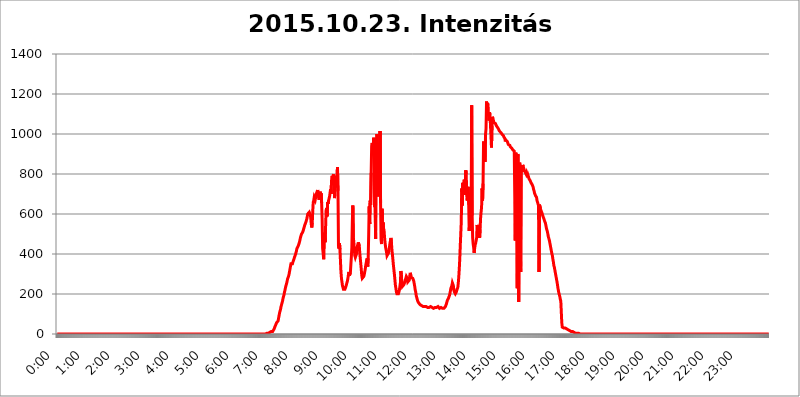
| Category | 2015.10.23. Intenzitás [W/m^2] |
|---|---|
| 0.0 | 0 |
| 0.0006944444444444445 | 0 |
| 0.001388888888888889 | 0 |
| 0.0020833333333333333 | 0 |
| 0.002777777777777778 | 0 |
| 0.003472222222222222 | 0 |
| 0.004166666666666667 | 0 |
| 0.004861111111111111 | 0 |
| 0.005555555555555556 | 0 |
| 0.0062499999999999995 | 0 |
| 0.006944444444444444 | 0 |
| 0.007638888888888889 | 0 |
| 0.008333333333333333 | 0 |
| 0.009027777777777779 | 0 |
| 0.009722222222222222 | 0 |
| 0.010416666666666666 | 0 |
| 0.011111111111111112 | 0 |
| 0.011805555555555555 | 0 |
| 0.012499999999999999 | 0 |
| 0.013194444444444444 | 0 |
| 0.013888888888888888 | 0 |
| 0.014583333333333332 | 0 |
| 0.015277777777777777 | 0 |
| 0.015972222222222224 | 0 |
| 0.016666666666666666 | 0 |
| 0.017361111111111112 | 0 |
| 0.018055555555555557 | 0 |
| 0.01875 | 0 |
| 0.019444444444444445 | 0 |
| 0.02013888888888889 | 0 |
| 0.020833333333333332 | 0 |
| 0.02152777777777778 | 0 |
| 0.022222222222222223 | 0 |
| 0.02291666666666667 | 0 |
| 0.02361111111111111 | 0 |
| 0.024305555555555556 | 0 |
| 0.024999999999999998 | 0 |
| 0.025694444444444447 | 0 |
| 0.02638888888888889 | 0 |
| 0.027083333333333334 | 0 |
| 0.027777777777777776 | 0 |
| 0.02847222222222222 | 0 |
| 0.029166666666666664 | 0 |
| 0.029861111111111113 | 0 |
| 0.030555555555555555 | 0 |
| 0.03125 | 0 |
| 0.03194444444444445 | 0 |
| 0.03263888888888889 | 0 |
| 0.03333333333333333 | 0 |
| 0.034027777777777775 | 0 |
| 0.034722222222222224 | 0 |
| 0.035416666666666666 | 0 |
| 0.036111111111111115 | 0 |
| 0.03680555555555556 | 0 |
| 0.0375 | 0 |
| 0.03819444444444444 | 0 |
| 0.03888888888888889 | 0 |
| 0.03958333333333333 | 0 |
| 0.04027777777777778 | 0 |
| 0.04097222222222222 | 0 |
| 0.041666666666666664 | 0 |
| 0.042361111111111106 | 0 |
| 0.04305555555555556 | 0 |
| 0.043750000000000004 | 0 |
| 0.044444444444444446 | 0 |
| 0.04513888888888889 | 0 |
| 0.04583333333333334 | 0 |
| 0.04652777777777778 | 0 |
| 0.04722222222222222 | 0 |
| 0.04791666666666666 | 0 |
| 0.04861111111111111 | 0 |
| 0.049305555555555554 | 0 |
| 0.049999999999999996 | 0 |
| 0.05069444444444445 | 0 |
| 0.051388888888888894 | 0 |
| 0.052083333333333336 | 0 |
| 0.05277777777777778 | 0 |
| 0.05347222222222222 | 0 |
| 0.05416666666666667 | 0 |
| 0.05486111111111111 | 0 |
| 0.05555555555555555 | 0 |
| 0.05625 | 0 |
| 0.05694444444444444 | 0 |
| 0.057638888888888885 | 0 |
| 0.05833333333333333 | 0 |
| 0.05902777777777778 | 0 |
| 0.059722222222222225 | 0 |
| 0.06041666666666667 | 0 |
| 0.061111111111111116 | 0 |
| 0.06180555555555556 | 0 |
| 0.0625 | 0 |
| 0.06319444444444444 | 0 |
| 0.06388888888888888 | 0 |
| 0.06458333333333334 | 0 |
| 0.06527777777777778 | 0 |
| 0.06597222222222222 | 0 |
| 0.06666666666666667 | 0 |
| 0.06736111111111111 | 0 |
| 0.06805555555555555 | 0 |
| 0.06874999999999999 | 0 |
| 0.06944444444444443 | 0 |
| 0.07013888888888889 | 0 |
| 0.07083333333333333 | 0 |
| 0.07152777777777779 | 0 |
| 0.07222222222222223 | 0 |
| 0.07291666666666667 | 0 |
| 0.07361111111111111 | 0 |
| 0.07430555555555556 | 0 |
| 0.075 | 0 |
| 0.07569444444444444 | 0 |
| 0.0763888888888889 | 0 |
| 0.07708333333333334 | 0 |
| 0.07777777777777778 | 0 |
| 0.07847222222222222 | 0 |
| 0.07916666666666666 | 0 |
| 0.0798611111111111 | 0 |
| 0.08055555555555556 | 0 |
| 0.08125 | 0 |
| 0.08194444444444444 | 0 |
| 0.08263888888888889 | 0 |
| 0.08333333333333333 | 0 |
| 0.08402777777777777 | 0 |
| 0.08472222222222221 | 0 |
| 0.08541666666666665 | 0 |
| 0.08611111111111112 | 0 |
| 0.08680555555555557 | 0 |
| 0.08750000000000001 | 0 |
| 0.08819444444444445 | 0 |
| 0.08888888888888889 | 0 |
| 0.08958333333333333 | 0 |
| 0.09027777777777778 | 0 |
| 0.09097222222222222 | 0 |
| 0.09166666666666667 | 0 |
| 0.09236111111111112 | 0 |
| 0.09305555555555556 | 0 |
| 0.09375 | 0 |
| 0.09444444444444444 | 0 |
| 0.09513888888888888 | 0 |
| 0.09583333333333333 | 0 |
| 0.09652777777777777 | 0 |
| 0.09722222222222222 | 0 |
| 0.09791666666666667 | 0 |
| 0.09861111111111111 | 0 |
| 0.09930555555555555 | 0 |
| 0.09999999999999999 | 0 |
| 0.10069444444444443 | 0 |
| 0.1013888888888889 | 0 |
| 0.10208333333333335 | 0 |
| 0.10277777777777779 | 0 |
| 0.10347222222222223 | 0 |
| 0.10416666666666667 | 0 |
| 0.10486111111111111 | 0 |
| 0.10555555555555556 | 0 |
| 0.10625 | 0 |
| 0.10694444444444444 | 0 |
| 0.1076388888888889 | 0 |
| 0.10833333333333334 | 0 |
| 0.10902777777777778 | 0 |
| 0.10972222222222222 | 0 |
| 0.1111111111111111 | 0 |
| 0.11180555555555556 | 0 |
| 0.11180555555555556 | 0 |
| 0.1125 | 0 |
| 0.11319444444444444 | 0 |
| 0.11388888888888889 | 0 |
| 0.11458333333333333 | 0 |
| 0.11527777777777777 | 0 |
| 0.11597222222222221 | 0 |
| 0.11666666666666665 | 0 |
| 0.1173611111111111 | 0 |
| 0.11805555555555557 | 0 |
| 0.11944444444444445 | 0 |
| 0.12013888888888889 | 0 |
| 0.12083333333333333 | 0 |
| 0.12152777777777778 | 0 |
| 0.12222222222222223 | 0 |
| 0.12291666666666667 | 0 |
| 0.12291666666666667 | 0 |
| 0.12361111111111112 | 0 |
| 0.12430555555555556 | 0 |
| 0.125 | 0 |
| 0.12569444444444444 | 0 |
| 0.12638888888888888 | 0 |
| 0.12708333333333333 | 0 |
| 0.16875 | 0 |
| 0.12847222222222224 | 0 |
| 0.12916666666666668 | 0 |
| 0.12986111111111112 | 0 |
| 0.13055555555555556 | 0 |
| 0.13125 | 0 |
| 0.13194444444444445 | 0 |
| 0.1326388888888889 | 0 |
| 0.13333333333333333 | 0 |
| 0.13402777777777777 | 0 |
| 0.13402777777777777 | 0 |
| 0.13472222222222222 | 0 |
| 0.13541666666666666 | 0 |
| 0.1361111111111111 | 0 |
| 0.13749999999999998 | 0 |
| 0.13819444444444443 | 0 |
| 0.1388888888888889 | 0 |
| 0.13958333333333334 | 0 |
| 0.14027777777777778 | 0 |
| 0.14097222222222222 | 0 |
| 0.14166666666666666 | 0 |
| 0.1423611111111111 | 0 |
| 0.14305555555555557 | 0 |
| 0.14375000000000002 | 0 |
| 0.14444444444444446 | 0 |
| 0.1451388888888889 | 0 |
| 0.1451388888888889 | 0 |
| 0.14652777777777778 | 0 |
| 0.14722222222222223 | 0 |
| 0.14791666666666667 | 0 |
| 0.1486111111111111 | 0 |
| 0.14930555555555555 | 0 |
| 0.15 | 0 |
| 0.15069444444444444 | 0 |
| 0.15138888888888888 | 0 |
| 0.15208333333333332 | 0 |
| 0.15277777777777776 | 0 |
| 0.15347222222222223 | 0 |
| 0.15416666666666667 | 0 |
| 0.15486111111111112 | 0 |
| 0.15555555555555556 | 0 |
| 0.15625 | 0 |
| 0.15694444444444444 | 0 |
| 0.15763888888888888 | 0 |
| 0.15833333333333333 | 0 |
| 0.15902777777777777 | 0 |
| 0.15972222222222224 | 0 |
| 0.16041666666666668 | 0 |
| 0.16111111111111112 | 0 |
| 0.16180555555555556 | 0 |
| 0.1625 | 0 |
| 0.16319444444444445 | 0 |
| 0.1638888888888889 | 0 |
| 0.16458333333333333 | 0 |
| 0.16527777777777777 | 0 |
| 0.16597222222222222 | 0 |
| 0.16666666666666666 | 0 |
| 0.1673611111111111 | 0 |
| 0.16805555555555554 | 0 |
| 0.16874999999999998 | 0 |
| 0.16944444444444443 | 0 |
| 0.17013888888888887 | 0 |
| 0.1708333333333333 | 0 |
| 0.17152777777777775 | 0 |
| 0.17222222222222225 | 0 |
| 0.1729166666666667 | 0 |
| 0.17361111111111113 | 0 |
| 0.17430555555555557 | 0 |
| 0.17500000000000002 | 0 |
| 0.17569444444444446 | 0 |
| 0.1763888888888889 | 0 |
| 0.17708333333333334 | 0 |
| 0.17777777777777778 | 0 |
| 0.17847222222222223 | 0 |
| 0.17916666666666667 | 0 |
| 0.1798611111111111 | 0 |
| 0.18055555555555555 | 0 |
| 0.18125 | 0 |
| 0.18194444444444444 | 0 |
| 0.1826388888888889 | 0 |
| 0.18333333333333335 | 0 |
| 0.1840277777777778 | 0 |
| 0.18472222222222223 | 0 |
| 0.18541666666666667 | 0 |
| 0.18611111111111112 | 0 |
| 0.18680555555555556 | 0 |
| 0.1875 | 0 |
| 0.18819444444444444 | 0 |
| 0.18888888888888888 | 0 |
| 0.18958333333333333 | 0 |
| 0.19027777777777777 | 0 |
| 0.1909722222222222 | 0 |
| 0.19166666666666665 | 0 |
| 0.19236111111111112 | 0 |
| 0.19305555555555554 | 0 |
| 0.19375 | 0 |
| 0.19444444444444445 | 0 |
| 0.1951388888888889 | 0 |
| 0.19583333333333333 | 0 |
| 0.19652777777777777 | 0 |
| 0.19722222222222222 | 0 |
| 0.19791666666666666 | 0 |
| 0.1986111111111111 | 0 |
| 0.19930555555555554 | 0 |
| 0.19999999999999998 | 0 |
| 0.20069444444444443 | 0 |
| 0.20138888888888887 | 0 |
| 0.2020833333333333 | 0 |
| 0.2027777777777778 | 0 |
| 0.2034722222222222 | 0 |
| 0.2041666666666667 | 0 |
| 0.20486111111111113 | 0 |
| 0.20555555555555557 | 0 |
| 0.20625000000000002 | 0 |
| 0.20694444444444446 | 0 |
| 0.2076388888888889 | 0 |
| 0.20833333333333334 | 0 |
| 0.20902777777777778 | 0 |
| 0.20972222222222223 | 0 |
| 0.21041666666666667 | 0 |
| 0.2111111111111111 | 0 |
| 0.21180555555555555 | 0 |
| 0.2125 | 0 |
| 0.21319444444444444 | 0 |
| 0.2138888888888889 | 0 |
| 0.21458333333333335 | 0 |
| 0.2152777777777778 | 0 |
| 0.21597222222222223 | 0 |
| 0.21666666666666667 | 0 |
| 0.21736111111111112 | 0 |
| 0.21805555555555556 | 0 |
| 0.21875 | 0 |
| 0.21944444444444444 | 0 |
| 0.22013888888888888 | 0 |
| 0.22083333333333333 | 0 |
| 0.22152777777777777 | 0 |
| 0.2222222222222222 | 0 |
| 0.22291666666666665 | 0 |
| 0.2236111111111111 | 0 |
| 0.22430555555555556 | 0 |
| 0.225 | 0 |
| 0.22569444444444445 | 0 |
| 0.2263888888888889 | 0 |
| 0.22708333333333333 | 0 |
| 0.22777777777777777 | 0 |
| 0.22847222222222222 | 0 |
| 0.22916666666666666 | 0 |
| 0.2298611111111111 | 0 |
| 0.23055555555555554 | 0 |
| 0.23124999999999998 | 0 |
| 0.23194444444444443 | 0 |
| 0.23263888888888887 | 0 |
| 0.2333333333333333 | 0 |
| 0.2340277777777778 | 0 |
| 0.2347222222222222 | 0 |
| 0.2354166666666667 | 0 |
| 0.23611111111111113 | 0 |
| 0.23680555555555557 | 0 |
| 0.23750000000000002 | 0 |
| 0.23819444444444446 | 0 |
| 0.2388888888888889 | 0 |
| 0.23958333333333334 | 0 |
| 0.24027777777777778 | 0 |
| 0.24097222222222223 | 0 |
| 0.24166666666666667 | 0 |
| 0.2423611111111111 | 0 |
| 0.24305555555555555 | 0 |
| 0.24375 | 0 |
| 0.24444444444444446 | 0 |
| 0.24513888888888888 | 0 |
| 0.24583333333333335 | 0 |
| 0.2465277777777778 | 0 |
| 0.24722222222222223 | 0 |
| 0.24791666666666667 | 0 |
| 0.24861111111111112 | 0 |
| 0.24930555555555556 | 0 |
| 0.25 | 0 |
| 0.25069444444444444 | 0 |
| 0.2513888888888889 | 0 |
| 0.2520833333333333 | 0 |
| 0.25277777777777777 | 0 |
| 0.2534722222222222 | 0 |
| 0.25416666666666665 | 0 |
| 0.2548611111111111 | 0 |
| 0.2555555555555556 | 0 |
| 0.25625000000000003 | 0 |
| 0.2569444444444445 | 0 |
| 0.2576388888888889 | 0 |
| 0.25833333333333336 | 0 |
| 0.2590277777777778 | 0 |
| 0.25972222222222224 | 0 |
| 0.2604166666666667 | 0 |
| 0.2611111111111111 | 0 |
| 0.26180555555555557 | 0 |
| 0.2625 | 0 |
| 0.26319444444444445 | 0 |
| 0.2638888888888889 | 0 |
| 0.26458333333333334 | 0 |
| 0.2652777777777778 | 0 |
| 0.2659722222222222 | 0 |
| 0.26666666666666666 | 0 |
| 0.2673611111111111 | 0 |
| 0.26805555555555555 | 0 |
| 0.26875 | 0 |
| 0.26944444444444443 | 0 |
| 0.2701388888888889 | 0 |
| 0.2708333333333333 | 0 |
| 0.27152777777777776 | 0 |
| 0.2722222222222222 | 0 |
| 0.27291666666666664 | 0 |
| 0.2736111111111111 | 0 |
| 0.2743055555555555 | 0 |
| 0.27499999999999997 | 0 |
| 0.27569444444444446 | 0 |
| 0.27638888888888885 | 0 |
| 0.27708333333333335 | 0 |
| 0.2777777777777778 | 0 |
| 0.27847222222222223 | 0 |
| 0.2791666666666667 | 0 |
| 0.2798611111111111 | 0 |
| 0.28055555555555556 | 0 |
| 0.28125 | 0 |
| 0.28194444444444444 | 0 |
| 0.2826388888888889 | 0 |
| 0.2833333333333333 | 0 |
| 0.28402777777777777 | 0 |
| 0.2847222222222222 | 0 |
| 0.28541666666666665 | 0 |
| 0.28611111111111115 | 0 |
| 0.28680555555555554 | 0 |
| 0.28750000000000003 | 0 |
| 0.2881944444444445 | 0 |
| 0.2888888888888889 | 0 |
| 0.28958333333333336 | 0 |
| 0.2902777777777778 | 0 |
| 0.29097222222222224 | 0 |
| 0.2916666666666667 | 0 |
| 0.2923611111111111 | 0 |
| 0.29305555555555557 | 3.525 |
| 0.29375 | 3.525 |
| 0.29444444444444445 | 3.525 |
| 0.2951388888888889 | 3.525 |
| 0.29583333333333334 | 3.525 |
| 0.2965277777777778 | 3.525 |
| 0.2972222222222222 | 3.525 |
| 0.29791666666666666 | 7.887 |
| 0.2986111111111111 | 7.887 |
| 0.29930555555555555 | 7.887 |
| 0.3 | 12.257 |
| 0.30069444444444443 | 12.257 |
| 0.3013888888888889 | 12.257 |
| 0.3020833333333333 | 12.257 |
| 0.30277777777777776 | 16.636 |
| 0.3034722222222222 | 16.636 |
| 0.30416666666666664 | 25.419 |
| 0.3048611111111111 | 29.823 |
| 0.3055555555555555 | 38.653 |
| 0.30624999999999997 | 43.079 |
| 0.3069444444444444 | 43.079 |
| 0.3076388888888889 | 56.398 |
| 0.30833333333333335 | 60.85 |
| 0.3090277777777778 | 60.85 |
| 0.30972222222222223 | 65.31 |
| 0.3104166666666667 | 78.722 |
| 0.3111111111111111 | 92.184 |
| 0.31180555555555556 | 105.69 |
| 0.3125 | 114.716 |
| 0.31319444444444444 | 123.758 |
| 0.3138888888888889 | 137.347 |
| 0.3145833333333333 | 146.423 |
| 0.31527777777777777 | 155.509 |
| 0.3159722222222222 | 164.605 |
| 0.31666666666666665 | 178.264 |
| 0.31736111111111115 | 187.378 |
| 0.31805555555555554 | 196.497 |
| 0.31875000000000003 | 210.182 |
| 0.3194444444444445 | 219.309 |
| 0.3201388888888889 | 233 |
| 0.32083333333333336 | 242.127 |
| 0.3215277777777778 | 251.251 |
| 0.32222222222222224 | 260.373 |
| 0.3229166666666667 | 274.047 |
| 0.3236111111111111 | 278.603 |
| 0.32430555555555557 | 287.709 |
| 0.325 | 296.808 |
| 0.32569444444444445 | 310.44 |
| 0.3263888888888889 | 324.052 |
| 0.32708333333333334 | 337.639 |
| 0.3277777777777778 | 351.198 |
| 0.3284722222222222 | 351.198 |
| 0.32916666666666666 | 351.198 |
| 0.3298611111111111 | 351.198 |
| 0.33055555555555555 | 360.221 |
| 0.33125 | 364.728 |
| 0.33194444444444443 | 373.729 |
| 0.3326388888888889 | 382.715 |
| 0.3333333333333333 | 382.715 |
| 0.3340277777777778 | 396.164 |
| 0.3347222222222222 | 405.108 |
| 0.3354166666666667 | 414.035 |
| 0.3361111111111111 | 427.39 |
| 0.3368055555555556 | 431.833 |
| 0.33749999999999997 | 436.27 |
| 0.33819444444444446 | 440.702 |
| 0.33888888888888885 | 449.551 |
| 0.33958333333333335 | 458.38 |
| 0.34027777777777773 | 467.187 |
| 0.34097222222222223 | 480.356 |
| 0.3416666666666666 | 480.356 |
| 0.3423611111111111 | 497.836 |
| 0.3430555555555555 | 497.836 |
| 0.34375 | 502.192 |
| 0.3444444444444445 | 510.885 |
| 0.3451388888888889 | 515.223 |
| 0.3458333333333334 | 515.223 |
| 0.34652777777777777 | 536.82 |
| 0.34722222222222227 | 545.416 |
| 0.34791666666666665 | 549.704 |
| 0.34861111111111115 | 558.261 |
| 0.34930555555555554 | 562.53 |
| 0.35000000000000003 | 575.299 |
| 0.3506944444444444 | 588.009 |
| 0.3513888888888889 | 600.661 |
| 0.3520833333333333 | 604.864 |
| 0.3527777777777778 | 600.661 |
| 0.3534722222222222 | 609.062 |
| 0.3541666666666667 | 613.252 |
| 0.3548611111111111 | 596.45 |
| 0.35555555555555557 | 579.542 |
| 0.35625 | 549.704 |
| 0.35694444444444445 | 532.513 |
| 0.3576388888888889 | 553.986 |
| 0.35833333333333334 | 613.252 |
| 0.3590277777777778 | 658.909 |
| 0.3597222222222222 | 667.123 |
| 0.36041666666666666 | 683.473 |
| 0.3611111111111111 | 679.395 |
| 0.36180555555555555 | 671.22 |
| 0.3625 | 675.311 |
| 0.36319444444444443 | 699.717 |
| 0.3638888888888889 | 703.762 |
| 0.3645833333333333 | 699.717 |
| 0.3652777777777778 | 719.877 |
| 0.3659722222222222 | 715.858 |
| 0.3666666666666667 | 719.877 |
| 0.3673611111111111 | 671.22 |
| 0.3680555555555556 | 679.395 |
| 0.36874999999999997 | 711.832 |
| 0.36944444444444446 | 683.473 |
| 0.37013888888888885 | 703.762 |
| 0.37083333333333335 | 654.791 |
| 0.37152777777777773 | 571.049 |
| 0.37222222222222223 | 427.39 |
| 0.3729166666666666 | 405.108 |
| 0.3736111111111111 | 373.729 |
| 0.3743055555555555 | 480.356 |
| 0.375 | 506.542 |
| 0.3756944444444445 | 458.38 |
| 0.3763888888888889 | 536.82 |
| 0.3770833333333334 | 617.436 |
| 0.37777777777777777 | 629.948 |
| 0.37847222222222227 | 588.009 |
| 0.37916666666666665 | 658.909 |
| 0.37986111111111115 | 650.667 |
| 0.38055555555555554 | 667.123 |
| 0.38125000000000003 | 667.123 |
| 0.3819444444444444 | 687.544 |
| 0.3826388888888889 | 691.608 |
| 0.3833333333333333 | 723.889 |
| 0.3840277777777778 | 699.717 |
| 0.3847222222222222 | 767.62 |
| 0.3854166666666667 | 791.169 |
| 0.3861111111111111 | 783.342 |
| 0.38680555555555557 | 779.42 |
| 0.3875 | 798.974 |
| 0.38819444444444445 | 763.674 |
| 0.3888888888888889 | 679.395 |
| 0.38958333333333334 | 723.889 |
| 0.3902777777777778 | 735.89 |
| 0.3909722222222222 | 755.766 |
| 0.39166666666666666 | 791.169 |
| 0.3923611111111111 | 783.342 |
| 0.39305555555555555 | 833.834 |
| 0.39375 | 715.858 |
| 0.39444444444444443 | 440.702 |
| 0.3951388888888889 | 427.39 |
| 0.3958333333333333 | 453.968 |
| 0.3965277777777778 | 422.943 |
| 0.3972222222222222 | 364.728 |
| 0.3979166666666667 | 310.44 |
| 0.3986111111111111 | 278.603 |
| 0.3993055555555556 | 260.373 |
| 0.39999999999999997 | 242.127 |
| 0.40069444444444446 | 233 |
| 0.40138888888888885 | 223.873 |
| 0.40208333333333335 | 219.309 |
| 0.40277777777777773 | 219.309 |
| 0.40347222222222223 | 223.873 |
| 0.4041666666666666 | 228.436 |
| 0.4048611111111111 | 237.564 |
| 0.4055555555555555 | 246.689 |
| 0.40625 | 255.813 |
| 0.4069444444444445 | 264.932 |
| 0.4076388888888889 | 278.603 |
| 0.4083333333333334 | 283.156 |
| 0.40902777777777777 | 310.44 |
| 0.40972222222222227 | 292.259 |
| 0.41041666666666665 | 292.259 |
| 0.41111111111111115 | 305.898 |
| 0.41180555555555554 | 310.44 |
| 0.41250000000000003 | 387.202 |
| 0.4131944444444444 | 431.833 |
| 0.4138888888888889 | 562.53 |
| 0.4145833333333333 | 642.4 |
| 0.4152777777777778 | 484.735 |
| 0.4159722222222222 | 458.38 |
| 0.4166666666666667 | 422.943 |
| 0.4173611111111111 | 391.685 |
| 0.41805555555555557 | 382.715 |
| 0.41875 | 387.202 |
| 0.41944444444444445 | 387.202 |
| 0.4201388888888889 | 405.108 |
| 0.42083333333333334 | 436.27 |
| 0.4215277777777778 | 440.702 |
| 0.4222222222222222 | 458.38 |
| 0.42291666666666666 | 462.786 |
| 0.4236111111111111 | 440.702 |
| 0.42430555555555555 | 405.108 |
| 0.425 | 400.638 |
| 0.42569444444444443 | 400.638 |
| 0.4263888888888889 | 324.052 |
| 0.4270833333333333 | 292.259 |
| 0.4277777777777778 | 278.603 |
| 0.4284722222222222 | 278.603 |
| 0.4291666666666667 | 278.603 |
| 0.4298611111111111 | 287.709 |
| 0.4305555555555556 | 296.808 |
| 0.43124999999999997 | 310.44 |
| 0.43194444444444446 | 324.052 |
| 0.43263888888888885 | 342.162 |
| 0.43333333333333335 | 355.712 |
| 0.43402777777777773 | 369.23 |
| 0.43472222222222223 | 378.224 |
| 0.4354166666666666 | 337.639 |
| 0.4361111111111111 | 378.224 |
| 0.4368055555555555 | 497.836 |
| 0.4375 | 638.256 |
| 0.4381944444444445 | 549.704 |
| 0.4388888888888889 | 667.123 |
| 0.4395833333333334 | 646.537 |
| 0.44027777777777777 | 806.757 |
| 0.44097222222222227 | 940.082 |
| 0.44166666666666665 | 955.071 |
| 0.44236111111111115 | 943.832 |
| 0.44305555555555554 | 932.576 |
| 0.44375000000000003 | 981.244 |
| 0.4444444444444444 | 891.099 |
| 0.4451388888888889 | 634.105 |
| 0.4458333333333333 | 667.123 |
| 0.4465277777777778 | 475.972 |
| 0.4472222222222222 | 977.508 |
| 0.4479166666666667 | 962.555 |
| 0.4486111111111111 | 999.916 |
| 0.44930555555555557 | 860.676 |
| 0.45 | 687.544 |
| 0.45069444444444445 | 928.819 |
| 0.4513888888888889 | 955.071 |
| 0.45208333333333334 | 711.832 |
| 0.4527777777777778 | 1014.852 |
| 0.4534722222222222 | 654.791 |
| 0.45416666666666666 | 471.582 |
| 0.4548611111111111 | 449.551 |
| 0.45555555555555555 | 625.784 |
| 0.45625 | 523.88 |
| 0.45694444444444443 | 558.261 |
| 0.4576388888888889 | 528.2 |
| 0.4583333333333333 | 519.555 |
| 0.4590277777777778 | 484.735 |
| 0.4597222222222222 | 458.38 |
| 0.4604166666666667 | 436.27 |
| 0.4611111111111111 | 422.943 |
| 0.4618055555555556 | 409.574 |
| 0.46249999999999997 | 391.685 |
| 0.46319444444444446 | 387.202 |
| 0.46388888888888885 | 396.164 |
| 0.46458333333333335 | 405.108 |
| 0.46527777777777773 | 414.035 |
| 0.46597222222222223 | 436.27 |
| 0.4666666666666666 | 453.968 |
| 0.4673611111111111 | 467.187 |
| 0.4680555555555555 | 480.356 |
| 0.46875 | 453.968 |
| 0.4694444444444445 | 418.492 |
| 0.4701388888888889 | 396.164 |
| 0.4708333333333334 | 369.23 |
| 0.47152777777777777 | 342.162 |
| 0.47222222222222227 | 319.517 |
| 0.47291666666666665 | 296.808 |
| 0.47361111111111115 | 269.49 |
| 0.47430555555555554 | 242.127 |
| 0.47500000000000003 | 228.436 |
| 0.4756944444444444 | 210.182 |
| 0.4763888888888889 | 201.058 |
| 0.4770833333333333 | 201.058 |
| 0.4777777777777778 | 201.058 |
| 0.4784722222222222 | 201.058 |
| 0.4791666666666667 | 210.182 |
| 0.4798611111111111 | 219.309 |
| 0.48055555555555557 | 237.564 |
| 0.48125 | 255.813 |
| 0.48194444444444445 | 314.98 |
| 0.4826388888888889 | 296.808 |
| 0.48333333333333334 | 255.813 |
| 0.4840277777777778 | 237.564 |
| 0.4847222222222222 | 237.564 |
| 0.48541666666666666 | 242.127 |
| 0.4861111111111111 | 246.689 |
| 0.48680555555555555 | 251.251 |
| 0.4875 | 260.373 |
| 0.48819444444444443 | 269.49 |
| 0.4888888888888889 | 278.603 |
| 0.4895833333333333 | 287.709 |
| 0.4902777777777778 | 292.259 |
| 0.4909722222222222 | 278.603 |
| 0.4916666666666667 | 260.373 |
| 0.4923611111111111 | 255.813 |
| 0.4930555555555556 | 260.373 |
| 0.49374999999999997 | 269.49 |
| 0.49444444444444446 | 292.259 |
| 0.49513888888888885 | 305.898 |
| 0.49583333333333335 | 296.808 |
| 0.49652777777777773 | 283.156 |
| 0.49722222222222223 | 278.603 |
| 0.4979166666666666 | 278.603 |
| 0.4986111111111111 | 278.603 |
| 0.4993055555555555 | 274.047 |
| 0.5 | 264.932 |
| 0.5006944444444444 | 251.251 |
| 0.5013888888888889 | 237.564 |
| 0.5020833333333333 | 219.309 |
| 0.5027777777777778 | 210.182 |
| 0.5034722222222222 | 191.937 |
| 0.5041666666666667 | 182.82 |
| 0.5048611111111111 | 173.709 |
| 0.5055555555555555 | 164.605 |
| 0.50625 | 160.056 |
| 0.5069444444444444 | 155.509 |
| 0.5076388888888889 | 155.509 |
| 0.5083333333333333 | 150.964 |
| 0.5090277777777777 | 146.423 |
| 0.5097222222222222 | 146.423 |
| 0.5104166666666666 | 146.423 |
| 0.5111111111111112 | 141.884 |
| 0.5118055555555555 | 137.347 |
| 0.5125000000000001 | 137.347 |
| 0.5131944444444444 | 137.347 |
| 0.513888888888889 | 137.347 |
| 0.5145833333333333 | 137.347 |
| 0.5152777777777778 | 137.347 |
| 0.5159722222222222 | 137.347 |
| 0.5166666666666667 | 132.814 |
| 0.517361111111111 | 137.347 |
| 0.5180555555555556 | 137.347 |
| 0.5187499999999999 | 132.814 |
| 0.5194444444444445 | 132.814 |
| 0.5201388888888888 | 132.814 |
| 0.5208333333333334 | 128.284 |
| 0.5215277777777778 | 132.814 |
| 0.5222222222222223 | 137.347 |
| 0.5229166666666667 | 137.347 |
| 0.5236111111111111 | 137.347 |
| 0.5243055555555556 | 137.347 |
| 0.525 | 132.814 |
| 0.5256944444444445 | 132.814 |
| 0.5263888888888889 | 128.284 |
| 0.5270833333333333 | 128.284 |
| 0.5277777777777778 | 128.284 |
| 0.5284722222222222 | 128.284 |
| 0.5291666666666667 | 128.284 |
| 0.5298611111111111 | 132.814 |
| 0.5305555555555556 | 132.814 |
| 0.53125 | 137.347 |
| 0.5319444444444444 | 132.814 |
| 0.5326388888888889 | 132.814 |
| 0.5333333333333333 | 132.814 |
| 0.5340277777777778 | 137.347 |
| 0.5347222222222222 | 132.814 |
| 0.5354166666666667 | 132.814 |
| 0.5361111111111111 | 128.284 |
| 0.5368055555555555 | 128.284 |
| 0.5375 | 128.284 |
| 0.5381944444444444 | 132.814 |
| 0.5388888888888889 | 132.814 |
| 0.5395833333333333 | 128.284 |
| 0.5402777777777777 | 128.284 |
| 0.5409722222222222 | 128.284 |
| 0.5416666666666666 | 128.284 |
| 0.5423611111111112 | 128.284 |
| 0.5430555555555555 | 128.284 |
| 0.5437500000000001 | 132.814 |
| 0.5444444444444444 | 137.347 |
| 0.545138888888889 | 141.884 |
| 0.5458333333333333 | 150.964 |
| 0.5465277777777778 | 160.056 |
| 0.5472222222222222 | 169.156 |
| 0.5479166666666667 | 173.709 |
| 0.548611111111111 | 178.264 |
| 0.5493055555555556 | 182.82 |
| 0.5499999999999999 | 191.937 |
| 0.5506944444444445 | 201.058 |
| 0.5513888888888888 | 214.746 |
| 0.5520833333333334 | 228.436 |
| 0.5527777777777778 | 233 |
| 0.5534722222222223 | 242.127 |
| 0.5541666666666667 | 255.813 |
| 0.5548611111111111 | 255.813 |
| 0.5555555555555556 | 242.127 |
| 0.55625 | 219.309 |
| 0.5569444444444445 | 210.182 |
| 0.5576388888888889 | 205.62 |
| 0.5583333333333333 | 201.058 |
| 0.5590277777777778 | 201.058 |
| 0.5597222222222222 | 210.182 |
| 0.5604166666666667 | 219.309 |
| 0.5611111111111111 | 223.873 |
| 0.5618055555555556 | 233 |
| 0.5625 | 255.813 |
| 0.5631944444444444 | 287.709 |
| 0.5638888888888889 | 328.584 |
| 0.5645833333333333 | 378.224 |
| 0.5652777777777778 | 445.129 |
| 0.5659722222222222 | 502.192 |
| 0.5666666666666667 | 562.53 |
| 0.5673611111111111 | 727.896 |
| 0.5680555555555555 | 642.4 |
| 0.56875 | 755.766 |
| 0.5694444444444444 | 695.666 |
| 0.5701388888888889 | 719.877 |
| 0.5708333333333333 | 771.559 |
| 0.5715277777777777 | 695.666 |
| 0.5722222222222222 | 699.717 |
| 0.5729166666666666 | 818.392 |
| 0.5736111111111112 | 798.974 |
| 0.5743055555555555 | 695.666 |
| 0.5750000000000001 | 667.123 |
| 0.5756944444444444 | 699.717 |
| 0.576388888888889 | 735.89 |
| 0.5770833333333333 | 646.537 |
| 0.5777777777777778 | 515.223 |
| 0.5784722222222222 | 562.53 |
| 0.5791666666666667 | 596.45 |
| 0.579861111111111 | 566.793 |
| 0.5805555555555556 | 642.4 |
| 0.5812499999999999 | 1143.232 |
| 0.5819444444444445 | 592.233 |
| 0.5826388888888888 | 480.356 |
| 0.5833333333333334 | 449.551 |
| 0.5840277777777778 | 431.833 |
| 0.5847222222222223 | 405.108 |
| 0.5854166666666667 | 427.39 |
| 0.5861111111111111 | 445.129 |
| 0.5868055555555556 | 453.968 |
| 0.5875 | 458.38 |
| 0.5881944444444445 | 480.356 |
| 0.5888888888888889 | 545.416 |
| 0.5895833333333333 | 536.82 |
| 0.5902777777777778 | 536.82 |
| 0.5909722222222222 | 528.2 |
| 0.5916666666666667 | 497.836 |
| 0.5923611111111111 | 480.356 |
| 0.5930555555555556 | 523.88 |
| 0.59375 | 579.542 |
| 0.5944444444444444 | 609.062 |
| 0.5951388888888889 | 634.105 |
| 0.5958333333333333 | 727.896 |
| 0.5965277777777778 | 667.123 |
| 0.5972222222222222 | 751.803 |
| 0.5979166666666667 | 962.555 |
| 0.5986111111111111 | 940.082 |
| 0.5993055555555555 | 928.819 |
| 0.6 | 860.676 |
| 0.6006944444444444 | 999.916 |
| 0.6013888888888889 | 1026.06 |
| 0.6020833333333333 | 1162.571 |
| 0.6027777777777777 | 1120.238 |
| 0.6034722222222222 | 1154.814 |
| 0.6041666666666666 | 1147.086 |
| 0.6048611111111112 | 1093.653 |
| 0.6055555555555555 | 1067.267 |
| 0.6062500000000001 | 1108.816 |
| 0.6069444444444444 | 1097.437 |
| 0.607638888888889 | 1093.653 |
| 0.6083333333333333 | 1093.653 |
| 0.6090277777777778 | 932.576 |
| 0.6097222222222222 | 1041.019 |
| 0.6104166666666667 | 1086.097 |
| 0.611111111111111 | 1074.789 |
| 0.6118055555555556 | 1067.267 |
| 0.6124999999999999 | 1056.004 |
| 0.6131944444444445 | 1059.756 |
| 0.6138888888888888 | 1056.004 |
| 0.6145833333333334 | 1052.255 |
| 0.6152777777777778 | 1048.508 |
| 0.6159722222222223 | 1041.019 |
| 0.6166666666666667 | 1037.277 |
| 0.6173611111111111 | 1033.537 |
| 0.6180555555555556 | 1033.537 |
| 0.61875 | 1026.06 |
| 0.6194444444444445 | 1022.323 |
| 0.6201388888888889 | 1014.852 |
| 0.6208333333333333 | 1011.118 |
| 0.6215277777777778 | 1011.118 |
| 0.6222222222222222 | 1007.383 |
| 0.6229166666666667 | 1007.383 |
| 0.6236111111111111 | 999.916 |
| 0.6243055555555556 | 996.182 |
| 0.625 | 996.182 |
| 0.6256944444444444 | 992.448 |
| 0.6263888888888889 | 984.98 |
| 0.6270833333333333 | 984.98 |
| 0.6277777777777778 | 977.508 |
| 0.6284722222222222 | 962.555 |
| 0.6291666666666667 | 970.034 |
| 0.6298611111111111 | 966.295 |
| 0.6305555555555555 | 966.295 |
| 0.63125 | 962.555 |
| 0.6319444444444444 | 958.814 |
| 0.6326388888888889 | 947.58 |
| 0.6333333333333333 | 943.832 |
| 0.6340277777777777 | 943.832 |
| 0.6347222222222222 | 943.832 |
| 0.6354166666666666 | 936.33 |
| 0.6361111111111112 | 940.082 |
| 0.6368055555555555 | 932.576 |
| 0.6375000000000001 | 928.819 |
| 0.6381944444444444 | 925.06 |
| 0.638888888888889 | 921.298 |
| 0.6395833333333333 | 921.298 |
| 0.6402777777777778 | 917.534 |
| 0.6409722222222222 | 913.766 |
| 0.6416666666666667 | 913.766 |
| 0.642361111111111 | 467.187 |
| 0.6430555555555556 | 906.223 |
| 0.6437499999999999 | 894.885 |
| 0.6444444444444445 | 894.885 |
| 0.6451388888888888 | 228.436 |
| 0.6458333333333334 | 898.668 |
| 0.6465277777777778 | 891.099 |
| 0.6472222222222223 | 160.056 |
| 0.6479166666666667 | 791.169 |
| 0.6486111111111111 | 856.855 |
| 0.6493055555555556 | 860.676 |
| 0.65 | 310.44 |
| 0.6506944444444445 | 841.526 |
| 0.6513888888888889 | 845.365 |
| 0.6520833333333333 | 810.641 |
| 0.6527777777777778 | 845.365 |
| 0.6534722222222222 | 837.682 |
| 0.6541666666666667 | 829.981 |
| 0.6548611111111111 | 829.981 |
| 0.6555555555555556 | 814.519 |
| 0.65625 | 814.519 |
| 0.6569444444444444 | 810.641 |
| 0.6576388888888889 | 798.974 |
| 0.6583333333333333 | 806.757 |
| 0.6590277777777778 | 798.974 |
| 0.6597222222222222 | 783.342 |
| 0.6604166666666667 | 791.169 |
| 0.6611111111111111 | 787.258 |
| 0.6618055555555555 | 775.492 |
| 0.6625 | 771.559 |
| 0.6631944444444444 | 767.62 |
| 0.6638888888888889 | 763.674 |
| 0.6645833333333333 | 755.766 |
| 0.6652777777777777 | 751.803 |
| 0.6659722222222222 | 747.834 |
| 0.6666666666666666 | 747.834 |
| 0.6673611111111111 | 735.89 |
| 0.6680555555555556 | 723.889 |
| 0.6687500000000001 | 715.858 |
| 0.6694444444444444 | 703.762 |
| 0.6701388888888888 | 703.762 |
| 0.6708333333333334 | 691.608 |
| 0.6715277777777778 | 687.544 |
| 0.6722222222222222 | 683.473 |
| 0.6729166666666666 | 667.123 |
| 0.6736111111111112 | 667.123 |
| 0.6743055555555556 | 667.123 |
| 0.6749999999999999 | 642.4 |
| 0.6756944444444444 | 310.44 |
| 0.6763888888888889 | 646.537 |
| 0.6770833333333334 | 642.4 |
| 0.6777777777777777 | 625.784 |
| 0.6784722222222223 | 617.436 |
| 0.6791666666666667 | 613.252 |
| 0.6798611111111111 | 604.864 |
| 0.6805555555555555 | 596.45 |
| 0.68125 | 588.009 |
| 0.6819444444444445 | 583.779 |
| 0.6826388888888889 | 575.299 |
| 0.6833333333333332 | 566.793 |
| 0.6840277777777778 | 562.53 |
| 0.6847222222222222 | 553.986 |
| 0.6854166666666667 | 541.121 |
| 0.686111111111111 | 528.2 |
| 0.6868055555555556 | 519.555 |
| 0.6875 | 510.885 |
| 0.6881944444444444 | 497.836 |
| 0.688888888888889 | 484.735 |
| 0.6895833333333333 | 480.356 |
| 0.6902777777777778 | 467.187 |
| 0.6909722222222222 | 453.968 |
| 0.6916666666666668 | 440.702 |
| 0.6923611111111111 | 427.39 |
| 0.6930555555555555 | 414.035 |
| 0.69375 | 400.638 |
| 0.6944444444444445 | 391.685 |
| 0.6951388888888889 | 373.729 |
| 0.6958333333333333 | 360.221 |
| 0.6965277777777777 | 342.162 |
| 0.6972222222222223 | 333.113 |
| 0.6979166666666666 | 319.517 |
| 0.6986111111111111 | 305.898 |
| 0.6993055555555556 | 292.259 |
| 0.7000000000000001 | 278.603 |
| 0.7006944444444444 | 264.932 |
| 0.7013888888888888 | 251.251 |
| 0.7020833333333334 | 233 |
| 0.7027777777777778 | 219.309 |
| 0.7034722222222222 | 205.62 |
| 0.7041666666666666 | 196.497 |
| 0.7048611111111112 | 187.378 |
| 0.7055555555555556 | 173.709 |
| 0.7062499999999999 | 164.605 |
| 0.7069444444444444 | 110.201 |
| 0.7076388888888889 | 56.398 |
| 0.7083333333333334 | 34.234 |
| 0.7090277777777777 | 34.234 |
| 0.7097222222222223 | 34.234 |
| 0.7104166666666667 | 29.823 |
| 0.7111111111111111 | 29.823 |
| 0.7118055555555555 | 29.823 |
| 0.7125 | 29.823 |
| 0.7131944444444445 | 25.419 |
| 0.7138888888888889 | 25.419 |
| 0.7145833333333332 | 25.419 |
| 0.7152777777777778 | 21.024 |
| 0.7159722222222222 | 21.024 |
| 0.7166666666666667 | 21.024 |
| 0.717361111111111 | 21.024 |
| 0.7180555555555556 | 16.636 |
| 0.71875 | 16.636 |
| 0.7194444444444444 | 16.636 |
| 0.720138888888889 | 16.636 |
| 0.7208333333333333 | 12.257 |
| 0.7215277777777778 | 12.257 |
| 0.7222222222222222 | 12.257 |
| 0.7229166666666668 | 12.257 |
| 0.7236111111111111 | 12.257 |
| 0.7243055555555555 | 7.887 |
| 0.725 | 7.887 |
| 0.7256944444444445 | 7.887 |
| 0.7263888888888889 | 7.887 |
| 0.7270833333333333 | 3.525 |
| 0.7277777777777777 | 3.525 |
| 0.7284722222222223 | 3.525 |
| 0.7291666666666666 | 3.525 |
| 0.7298611111111111 | 3.525 |
| 0.7305555555555556 | 3.525 |
| 0.7312500000000001 | 3.525 |
| 0.7319444444444444 | 3.525 |
| 0.7326388888888888 | 3.525 |
| 0.7333333333333334 | 0 |
| 0.7340277777777778 | 0 |
| 0.7347222222222222 | 0 |
| 0.7354166666666666 | 0 |
| 0.7361111111111112 | 0 |
| 0.7368055555555556 | 0 |
| 0.7374999999999999 | 0 |
| 0.7381944444444444 | 0 |
| 0.7388888888888889 | 0 |
| 0.7395833333333334 | 0 |
| 0.7402777777777777 | 0 |
| 0.7409722222222223 | 0 |
| 0.7416666666666667 | 0 |
| 0.7423611111111111 | 0 |
| 0.7430555555555555 | 0 |
| 0.74375 | 0 |
| 0.7444444444444445 | 0 |
| 0.7451388888888889 | 0 |
| 0.7458333333333332 | 0 |
| 0.7465277777777778 | 0 |
| 0.7472222222222222 | 0 |
| 0.7479166666666667 | 0 |
| 0.748611111111111 | 0 |
| 0.7493055555555556 | 0 |
| 0.75 | 0 |
| 0.7506944444444444 | 0 |
| 0.751388888888889 | 0 |
| 0.7520833333333333 | 0 |
| 0.7527777777777778 | 0 |
| 0.7534722222222222 | 0 |
| 0.7541666666666668 | 0 |
| 0.7548611111111111 | 0 |
| 0.7555555555555555 | 0 |
| 0.75625 | 0 |
| 0.7569444444444445 | 0 |
| 0.7576388888888889 | 0 |
| 0.7583333333333333 | 0 |
| 0.7590277777777777 | 0 |
| 0.7597222222222223 | 0 |
| 0.7604166666666666 | 0 |
| 0.7611111111111111 | 0 |
| 0.7618055555555556 | 0 |
| 0.7625000000000001 | 0 |
| 0.7631944444444444 | 0 |
| 0.7638888888888888 | 0 |
| 0.7645833333333334 | 0 |
| 0.7652777777777778 | 0 |
| 0.7659722222222222 | 0 |
| 0.7666666666666666 | 0 |
| 0.7673611111111112 | 0 |
| 0.7680555555555556 | 0 |
| 0.7687499999999999 | 0 |
| 0.7694444444444444 | 0 |
| 0.7701388888888889 | 0 |
| 0.7708333333333334 | 0 |
| 0.7715277777777777 | 0 |
| 0.7722222222222223 | 0 |
| 0.7729166666666667 | 0 |
| 0.7736111111111111 | 0 |
| 0.7743055555555555 | 0 |
| 0.775 | 0 |
| 0.7756944444444445 | 0 |
| 0.7763888888888889 | 0 |
| 0.7770833333333332 | 0 |
| 0.7777777777777778 | 0 |
| 0.7784722222222222 | 0 |
| 0.7791666666666667 | 0 |
| 0.779861111111111 | 0 |
| 0.7805555555555556 | 0 |
| 0.78125 | 0 |
| 0.7819444444444444 | 0 |
| 0.782638888888889 | 0 |
| 0.7833333333333333 | 0 |
| 0.7840277777777778 | 0 |
| 0.7847222222222222 | 0 |
| 0.7854166666666668 | 0 |
| 0.7861111111111111 | 0 |
| 0.7868055555555555 | 0 |
| 0.7875 | 0 |
| 0.7881944444444445 | 0 |
| 0.7888888888888889 | 0 |
| 0.7895833333333333 | 0 |
| 0.7902777777777777 | 0 |
| 0.7909722222222223 | 0 |
| 0.7916666666666666 | 0 |
| 0.7923611111111111 | 0 |
| 0.7930555555555556 | 0 |
| 0.7937500000000001 | 0 |
| 0.7944444444444444 | 0 |
| 0.7951388888888888 | 0 |
| 0.7958333333333334 | 0 |
| 0.7965277777777778 | 0 |
| 0.7972222222222222 | 0 |
| 0.7979166666666666 | 0 |
| 0.7986111111111112 | 0 |
| 0.7993055555555556 | 0 |
| 0.7999999999999999 | 0 |
| 0.8006944444444444 | 0 |
| 0.8013888888888889 | 0 |
| 0.8020833333333334 | 0 |
| 0.8027777777777777 | 0 |
| 0.8034722222222223 | 0 |
| 0.8041666666666667 | 0 |
| 0.8048611111111111 | 0 |
| 0.8055555555555555 | 0 |
| 0.80625 | 0 |
| 0.8069444444444445 | 0 |
| 0.8076388888888889 | 0 |
| 0.8083333333333332 | 0 |
| 0.8090277777777778 | 0 |
| 0.8097222222222222 | 0 |
| 0.8104166666666667 | 0 |
| 0.811111111111111 | 0 |
| 0.8118055555555556 | 0 |
| 0.8125 | 0 |
| 0.8131944444444444 | 0 |
| 0.813888888888889 | 0 |
| 0.8145833333333333 | 0 |
| 0.8152777777777778 | 0 |
| 0.8159722222222222 | 0 |
| 0.8166666666666668 | 0 |
| 0.8173611111111111 | 0 |
| 0.8180555555555555 | 0 |
| 0.81875 | 0 |
| 0.8194444444444445 | 0 |
| 0.8201388888888889 | 0 |
| 0.8208333333333333 | 0 |
| 0.8215277777777777 | 0 |
| 0.8222222222222223 | 0 |
| 0.8229166666666666 | 0 |
| 0.8236111111111111 | 0 |
| 0.8243055555555556 | 0 |
| 0.8250000000000001 | 0 |
| 0.8256944444444444 | 0 |
| 0.8263888888888888 | 0 |
| 0.8270833333333334 | 0 |
| 0.8277777777777778 | 0 |
| 0.8284722222222222 | 0 |
| 0.8291666666666666 | 0 |
| 0.8298611111111112 | 0 |
| 0.8305555555555556 | 0 |
| 0.8312499999999999 | 0 |
| 0.8319444444444444 | 0 |
| 0.8326388888888889 | 0 |
| 0.8333333333333334 | 0 |
| 0.8340277777777777 | 0 |
| 0.8347222222222223 | 0 |
| 0.8354166666666667 | 0 |
| 0.8361111111111111 | 0 |
| 0.8368055555555555 | 0 |
| 0.8375 | 0 |
| 0.8381944444444445 | 0 |
| 0.8388888888888889 | 0 |
| 0.8395833333333332 | 0 |
| 0.8402777777777778 | 0 |
| 0.8409722222222222 | 0 |
| 0.8416666666666667 | 0 |
| 0.842361111111111 | 0 |
| 0.8430555555555556 | 0 |
| 0.84375 | 0 |
| 0.8444444444444444 | 0 |
| 0.845138888888889 | 0 |
| 0.8458333333333333 | 0 |
| 0.8465277777777778 | 0 |
| 0.8472222222222222 | 0 |
| 0.8479166666666668 | 0 |
| 0.8486111111111111 | 0 |
| 0.8493055555555555 | 0 |
| 0.85 | 0 |
| 0.8506944444444445 | 0 |
| 0.8513888888888889 | 0 |
| 0.8520833333333333 | 0 |
| 0.8527777777777777 | 0 |
| 0.8534722222222223 | 0 |
| 0.8541666666666666 | 0 |
| 0.8548611111111111 | 0 |
| 0.8555555555555556 | 0 |
| 0.8562500000000001 | 0 |
| 0.8569444444444444 | 0 |
| 0.8576388888888888 | 0 |
| 0.8583333333333334 | 0 |
| 0.8590277777777778 | 0 |
| 0.8597222222222222 | 0 |
| 0.8604166666666666 | 0 |
| 0.8611111111111112 | 0 |
| 0.8618055555555556 | 0 |
| 0.8624999999999999 | 0 |
| 0.8631944444444444 | 0 |
| 0.8638888888888889 | 0 |
| 0.8645833333333334 | 0 |
| 0.8652777777777777 | 0 |
| 0.8659722222222223 | 0 |
| 0.8666666666666667 | 0 |
| 0.8673611111111111 | 0 |
| 0.8680555555555555 | 0 |
| 0.86875 | 0 |
| 0.8694444444444445 | 0 |
| 0.8701388888888889 | 0 |
| 0.8708333333333332 | 0 |
| 0.8715277777777778 | 0 |
| 0.8722222222222222 | 0 |
| 0.8729166666666667 | 0 |
| 0.873611111111111 | 0 |
| 0.8743055555555556 | 0 |
| 0.875 | 0 |
| 0.8756944444444444 | 0 |
| 0.876388888888889 | 0 |
| 0.8770833333333333 | 0 |
| 0.8777777777777778 | 0 |
| 0.8784722222222222 | 0 |
| 0.8791666666666668 | 0 |
| 0.8798611111111111 | 0 |
| 0.8805555555555555 | 0 |
| 0.88125 | 0 |
| 0.8819444444444445 | 0 |
| 0.8826388888888889 | 0 |
| 0.8833333333333333 | 0 |
| 0.8840277777777777 | 0 |
| 0.8847222222222223 | 0 |
| 0.8854166666666666 | 0 |
| 0.8861111111111111 | 0 |
| 0.8868055555555556 | 0 |
| 0.8875000000000001 | 0 |
| 0.8881944444444444 | 0 |
| 0.8888888888888888 | 0 |
| 0.8895833333333334 | 0 |
| 0.8902777777777778 | 0 |
| 0.8909722222222222 | 0 |
| 0.8916666666666666 | 0 |
| 0.8923611111111112 | 0 |
| 0.8930555555555556 | 0 |
| 0.8937499999999999 | 0 |
| 0.8944444444444444 | 0 |
| 0.8951388888888889 | 0 |
| 0.8958333333333334 | 0 |
| 0.8965277777777777 | 0 |
| 0.8972222222222223 | 0 |
| 0.8979166666666667 | 0 |
| 0.8986111111111111 | 0 |
| 0.8993055555555555 | 0 |
| 0.9 | 0 |
| 0.9006944444444445 | 0 |
| 0.9013888888888889 | 0 |
| 0.9020833333333332 | 0 |
| 0.9027777777777778 | 0 |
| 0.9034722222222222 | 0 |
| 0.9041666666666667 | 0 |
| 0.904861111111111 | 0 |
| 0.9055555555555556 | 0 |
| 0.90625 | 0 |
| 0.9069444444444444 | 0 |
| 0.907638888888889 | 0 |
| 0.9083333333333333 | 0 |
| 0.9090277777777778 | 0 |
| 0.9097222222222222 | 0 |
| 0.9104166666666668 | 0 |
| 0.9111111111111111 | 0 |
| 0.9118055555555555 | 0 |
| 0.9125 | 0 |
| 0.9131944444444445 | 0 |
| 0.9138888888888889 | 0 |
| 0.9145833333333333 | 0 |
| 0.9152777777777777 | 0 |
| 0.9159722222222223 | 0 |
| 0.9166666666666666 | 0 |
| 0.9173611111111111 | 0 |
| 0.9180555555555556 | 0 |
| 0.9187500000000001 | 0 |
| 0.9194444444444444 | 0 |
| 0.9201388888888888 | 0 |
| 0.9208333333333334 | 0 |
| 0.9215277777777778 | 0 |
| 0.9222222222222222 | 0 |
| 0.9229166666666666 | 0 |
| 0.9236111111111112 | 0 |
| 0.9243055555555556 | 0 |
| 0.9249999999999999 | 0 |
| 0.9256944444444444 | 0 |
| 0.9263888888888889 | 0 |
| 0.9270833333333334 | 0 |
| 0.9277777777777777 | 0 |
| 0.9284722222222223 | 0 |
| 0.9291666666666667 | 0 |
| 0.9298611111111111 | 0 |
| 0.9305555555555555 | 0 |
| 0.93125 | 0 |
| 0.9319444444444445 | 0 |
| 0.9326388888888889 | 0 |
| 0.9333333333333332 | 0 |
| 0.9340277777777778 | 0 |
| 0.9347222222222222 | 0 |
| 0.9354166666666667 | 0 |
| 0.936111111111111 | 0 |
| 0.9368055555555556 | 0 |
| 0.9375 | 0 |
| 0.9381944444444444 | 0 |
| 0.938888888888889 | 0 |
| 0.9395833333333333 | 0 |
| 0.9402777777777778 | 0 |
| 0.9409722222222222 | 0 |
| 0.9416666666666668 | 0 |
| 0.9423611111111111 | 0 |
| 0.9430555555555555 | 0 |
| 0.94375 | 0 |
| 0.9444444444444445 | 0 |
| 0.9451388888888889 | 0 |
| 0.9458333333333333 | 0 |
| 0.9465277777777777 | 0 |
| 0.9472222222222223 | 0 |
| 0.9479166666666666 | 0 |
| 0.9486111111111111 | 0 |
| 0.9493055555555556 | 0 |
| 0.9500000000000001 | 0 |
| 0.9506944444444444 | 0 |
| 0.9513888888888888 | 0 |
| 0.9520833333333334 | 0 |
| 0.9527777777777778 | 0 |
| 0.9534722222222222 | 0 |
| 0.9541666666666666 | 0 |
| 0.9548611111111112 | 0 |
| 0.9555555555555556 | 0 |
| 0.9562499999999999 | 0 |
| 0.9569444444444444 | 0 |
| 0.9576388888888889 | 0 |
| 0.9583333333333334 | 0 |
| 0.9590277777777777 | 0 |
| 0.9597222222222223 | 0 |
| 0.9604166666666667 | 0 |
| 0.9611111111111111 | 0 |
| 0.9618055555555555 | 0 |
| 0.9625 | 0 |
| 0.9631944444444445 | 0 |
| 0.9638888888888889 | 0 |
| 0.9645833333333332 | 0 |
| 0.9652777777777778 | 0 |
| 0.9659722222222222 | 0 |
| 0.9666666666666667 | 0 |
| 0.967361111111111 | 0 |
| 0.9680555555555556 | 0 |
| 0.96875 | 0 |
| 0.9694444444444444 | 0 |
| 0.970138888888889 | 0 |
| 0.9708333333333333 | 0 |
| 0.9715277777777778 | 0 |
| 0.9722222222222222 | 0 |
| 0.9729166666666668 | 0 |
| 0.9736111111111111 | 0 |
| 0.9743055555555555 | 0 |
| 0.975 | 0 |
| 0.9756944444444445 | 0 |
| 0.9763888888888889 | 0 |
| 0.9770833333333333 | 0 |
| 0.9777777777777777 | 0 |
| 0.9784722222222223 | 0 |
| 0.9791666666666666 | 0 |
| 0.9798611111111111 | 0 |
| 0.9805555555555556 | 0 |
| 0.9812500000000001 | 0 |
| 0.9819444444444444 | 0 |
| 0.9826388888888888 | 0 |
| 0.9833333333333334 | 0 |
| 0.9840277777777778 | 0 |
| 0.9847222222222222 | 0 |
| 0.9854166666666666 | 0 |
| 0.9861111111111112 | 0 |
| 0.9868055555555556 | 0 |
| 0.9874999999999999 | 0 |
| 0.9881944444444444 | 0 |
| 0.9888888888888889 | 0 |
| 0.9895833333333334 | 0 |
| 0.9902777777777777 | 0 |
| 0.9909722222222223 | 0 |
| 0.9916666666666667 | 0 |
| 0.9923611111111111 | 0 |
| 0.9930555555555555 | 0 |
| 0.99375 | 0 |
| 0.9944444444444445 | 0 |
| 0.9951388888888889 | 0 |
| 0.9958333333333332 | 0 |
| 0.9965277777777778 | 0 |
| 0.9972222222222222 | 0 |
| 0.9979166666666667 | 0 |
| 0.998611111111111 | 0 |
| 0.9993055555555556 | 0 |